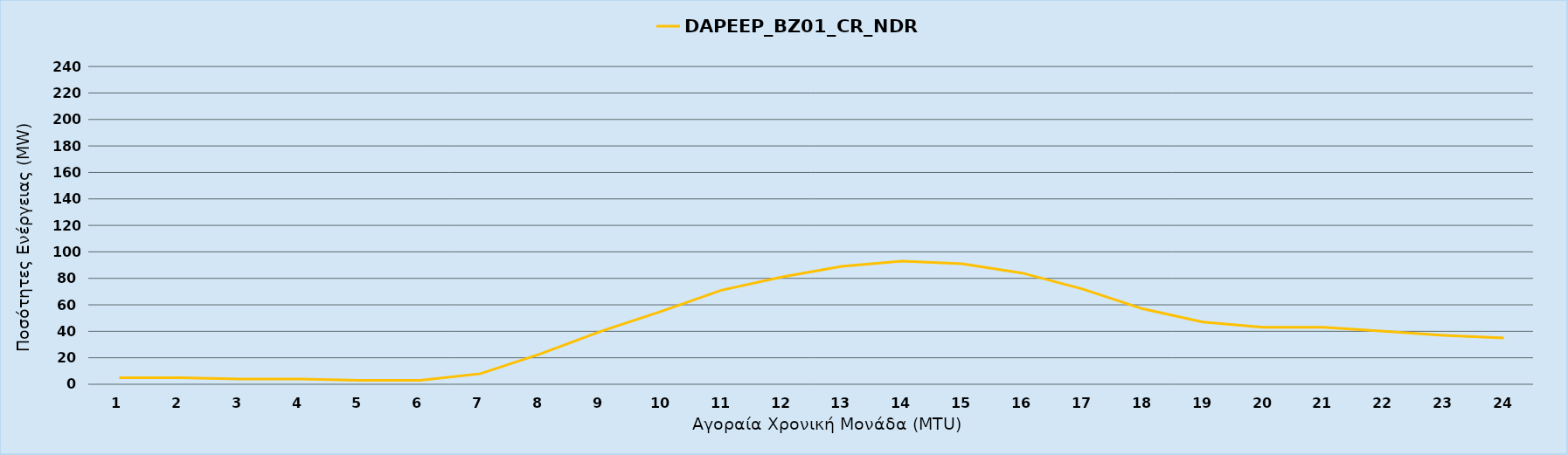
| Category | DAPEEP_BZ01_CR_NDR |
|---|---|
| 0 | 5 |
| 1 | 5 |
| 2 | 4 |
| 3 | 4 |
| 4 | 3 |
| 5 | 3 |
| 6 | 8 |
| 7 | 23 |
| 8 | 40 |
| 9 | 55 |
| 10 | 71 |
| 11 | 81 |
| 12 | 89 |
| 13 | 93 |
| 14 | 91 |
| 15 | 84 |
| 16 | 72 |
| 17 | 57 |
| 18 | 47 |
| 19 | 43 |
| 20 | 43 |
| 21 | 40 |
| 22 | 37 |
| 23 | 35 |